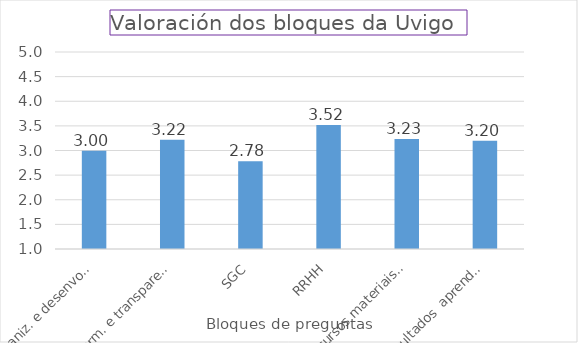
| Category | Series 0 |
|---|---|
| Organiz. e desenvolv. | 2.997 |
| Inform. e transparencia | 3.221 |
| SGC | 2.782 |
| RRHH | 3.516 |
| Recursos materiais e servizos | 3.232 |
| Resultados  aprendizaxe | 3.2 |